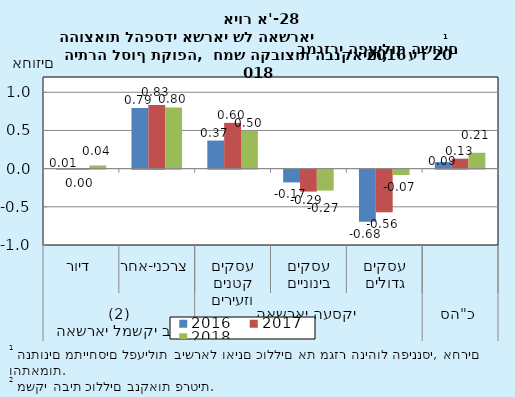
| Category | 2016 | 2017 | 2018 |
|---|---|---|---|
| 0 | 0.005 | 0.005 | 0.042 |
| 1 | 0.794 | 0.833 | 0.801 |
| 2 | 0.368 | 0.599 | 0.495 |
| 3 | -0.167 | -0.288 | -0.275 |
| 4 | -0.682 | -0.559 | -0.07 |
| 5 | 0.086 | 0.13 | 0.208 |